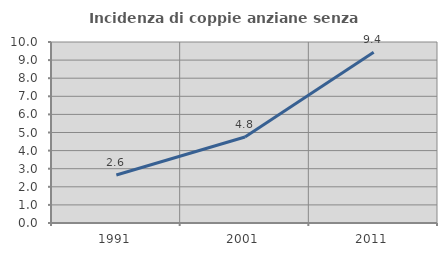
| Category | Incidenza di coppie anziane senza figli  |
|---|---|
| 1991.0 | 2.649 |
| 2001.0 | 4.755 |
| 2011.0 | 9.434 |